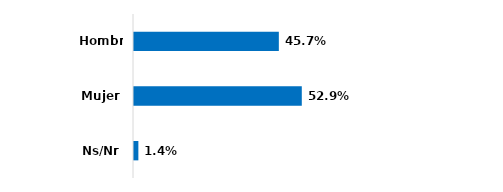
| Category | Series 0 |
|---|---|
| Hombre | 0.457 |
| Mujer | 0.529 |
| Ns/Nr | 0.014 |